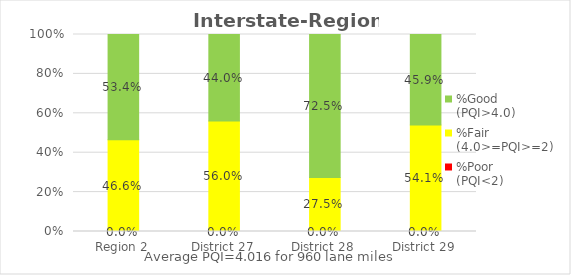
| Category | %Poor
(PQI<2) | %Fair
(4.0>=PQI>=2) | %Good
(PQI>4.0) |
|---|---|---|---|
| Region 2 | 0 | 0.466 | 0.534 |
| District 27 | 0 | 0.56 | 0.44 |
| District 28 | 0 | 0.275 | 0.725 |
| District 29 | 0 | 0.541 | 0.459 |